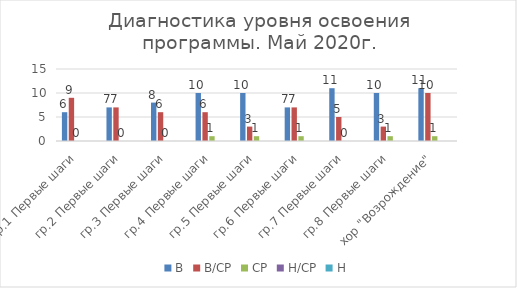
| Category | В | В/СР | СР | Н/СР | Н |
|---|---|---|---|---|---|
| гр.1 Первые шаги | 6 | 9 | 0 | 0 | 0 |
| гр.2 Первые шаги | 7 | 7 | 0 | 0 | 0 |
| гр.3 Первые шаги | 8 | 6 | 0 | 0 | 0 |
| гр.4 Первые шаги | 10 | 6 | 1 | 0 | 0 |
| гр.5 Первые шаги | 10 | 3 | 1 | 0 | 0 |
| гр.6 Первые шаги | 7 | 7 | 1 | 0 | 0 |
| гр.7 Первые шаги | 11 | 5 | 0 | 0 | 0 |
| гр.8 Первые шаги | 10 | 3 | 1 | 0 | 0 |
| хор "Возрождение" | 11 | 10 | 1 | 0 | 0 |